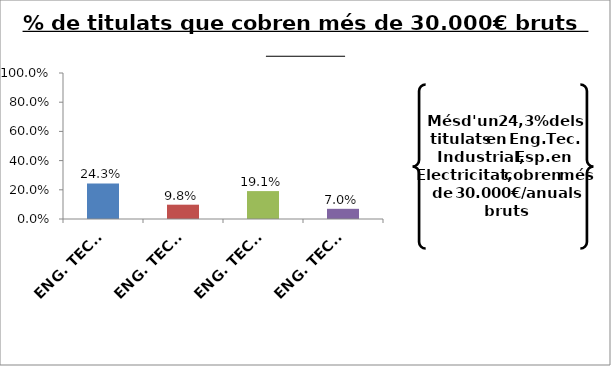
| Category | Series 0 |
|---|---|
| ENG. TECN. INDUSTRIAL, ESPEC. EN ELECTRICITAT | 0.243 |
| ENG. TECN. INDUSTRIAL, ESPEC. EN ELECTRONICA INDUSTRIAL | 0.098 |
| ENG. TECN. INDUSTRIAL, ESPEC. EN MECANICA | 0.191 |
| ENG. TECN. INDUSTRIAL, ESPEC. EN QUÍMICA INDUSTRIAL | 0.07 |